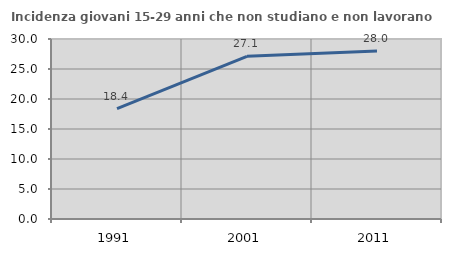
| Category | Incidenza giovani 15-29 anni che non studiano e non lavorano  |
|---|---|
| 1991.0 | 18.39 |
| 2001.0 | 27.119 |
| 2011.0 | 28 |